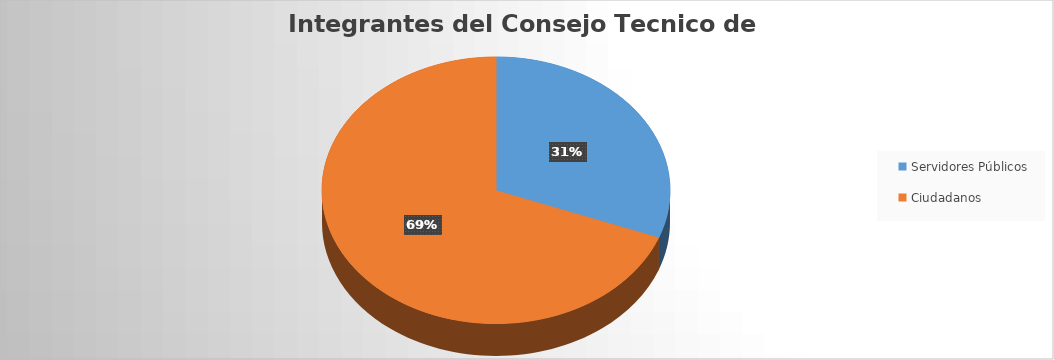
| Category | Series 0 |
|---|---|
| Servidores Públicos | 4 |
| Ciudadanos | 9 |